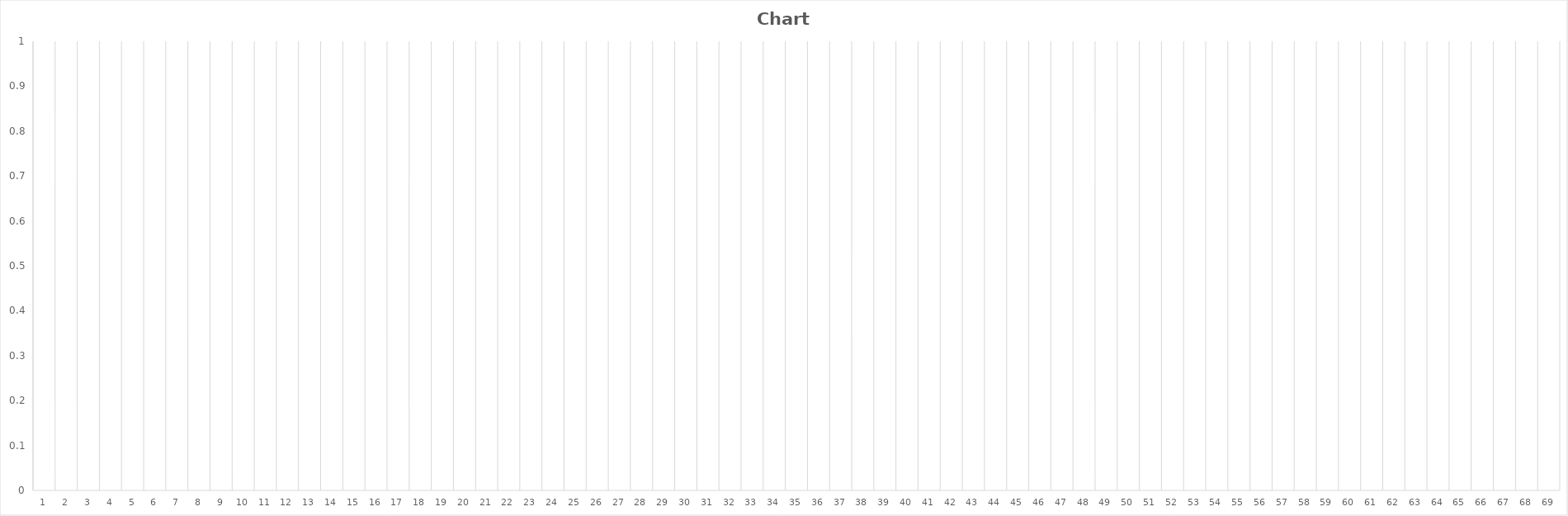
| Category | Series 0 |
|---|---|
| 0 | 0 |
| 1 | 0 |
| 2 | 0 |
| 3 | 0 |
| 4 | 0 |
| 5 | 0 |
| 6 | 0 |
| 7 | 0 |
| 8 | 0 |
| 9 | 0 |
| 10 | 0 |
| 11 | 0 |
| 12 | 0 |
| 13 | 0 |
| 14 | 0 |
| 15 | 0 |
| 16 | 0 |
| 17 | 0 |
| 18 | 0 |
| 19 | 0 |
| 20 | 0 |
| 21 | 0 |
| 22 | 0 |
| 23 | 0 |
| 24 | 0 |
| 25 | 0 |
| 26 | 0 |
| 27 | 0 |
| 28 | 0 |
| 29 | 0 |
| 30 | 0 |
| 31 | 0 |
| 32 | 0 |
| 33 | 0 |
| 34 | 0 |
| 35 | 0 |
| 36 | 0 |
| 37 | 0 |
| 38 | 0 |
| 39 | 0 |
| 40 | 0 |
| 41 | 0 |
| 42 | 0 |
| 43 | 0 |
| 44 | 0 |
| 45 | 0 |
| 46 | 0 |
| 47 | 0 |
| 48 | 0 |
| 49 | 0 |
| 50 | 0 |
| 51 | 0 |
| 52 | 0 |
| 53 | 0 |
| 54 | 0 |
| 55 | 0 |
| 56 | 0 |
| 57 | 0 |
| 58 | 0 |
| 59 | 0 |
| 60 | 0 |
| 61 | 0 |
| 62 | 0 |
| 63 | 0 |
| 64 | 0 |
| 65 | 0 |
| 66 | 0 |
| 67 | 0 |
| 68 | 0 |